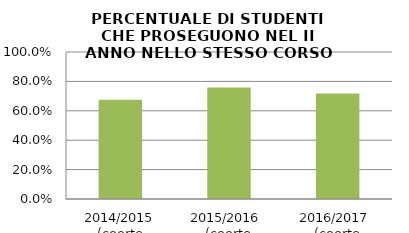
| Category | 2014/2015 (coorte 2013/14) 2015/2016  (coorte 2014/15) 2016/2017  (coorte 2015/16) |
|---|---|
| 2014/2015 (coorte 2013/14) | 0.674 |
| 2015/2016  (coorte 2014/15) | 0.759 |
| 2016/2017  (coorte 2015/16) | 0.718 |